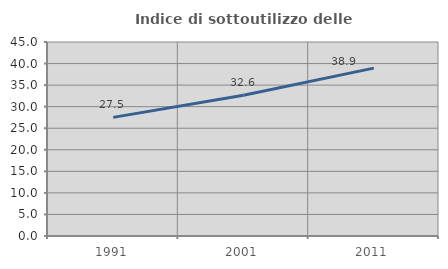
| Category | Indice di sottoutilizzo delle abitazioni  |
|---|---|
| 1991.0 | 27.515 |
| 2001.0 | 32.648 |
| 2011.0 | 38.941 |